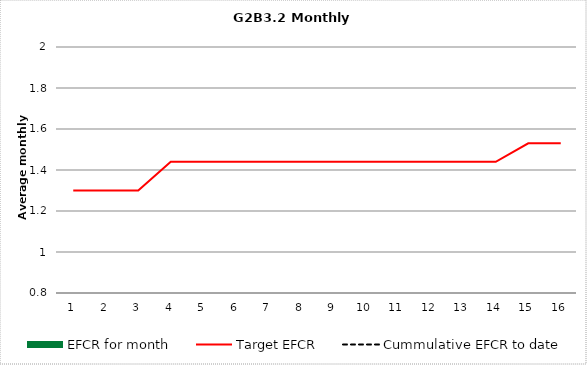
| Category | EFCR for month |
|---|---|
| 0 | 0 |
| 1 | 0 |
| 2 | 0 |
| 3 | 0 |
| 4 | 0 |
| 5 | 0 |
| 6 | 0 |
| 7 | 0 |
| 8 | 0 |
| 9 | 0 |
| 10 | 0 |
| 11 | 0 |
| 12 | 0 |
| 13 | 0 |
| 14 | 0 |
| 15 | 0 |